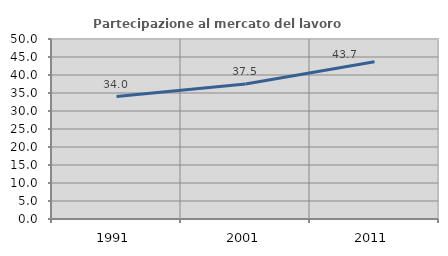
| Category | Partecipazione al mercato del lavoro  femminile |
|---|---|
| 1991.0 | 34 |
| 2001.0 | 37.5 |
| 2011.0 | 43.662 |